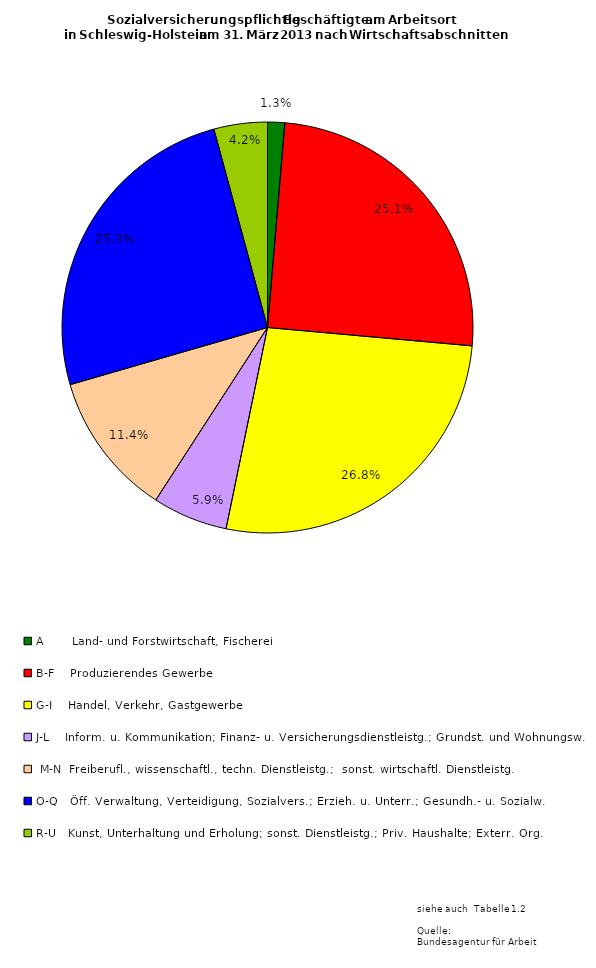
| Category | Series 0 | Series 1 | Series 2 |
|---|---|---|---|
| A       Land- und Forstwirtschaft, Fischerei | 11584 | 3229 | 8355 |
| B-F    Produzierendes Gewerbe | 215533 | 49874 | 165659 |
| G-I    Handel, Verkehr, Gastgewerbe | 230384 | 104134 | 126250 |
| J-L    Inform. u. Kommunikation; Finanz- u. Versicherungsdienstleistg.; Grundst. und Wohnungsw. | 50807 | 24769 | 26038 |
|  M-N  Freiberufl., wissenschaftl., techn. Dienstleistg.;  sonst. wirtschaftl. Dienstleistg.  | 97692 | 47677 | 50015 |
| O-Q   Öff. Verwaltung, Verteidigung, Sozialvers.; Erzieh. u. Unterr.; Gesundh.- u. Sozialw. | 217300 | 157362 | 59938 |
| R-U   Kunst, Unterhaltung und Erholung; sonst. Dienstleistg.; Priv. Haushalte; Exterr. Org. | 36116 | 24957 | 11159 |